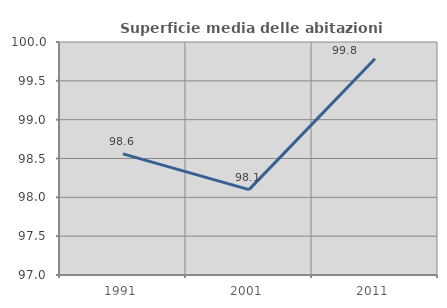
| Category | Superficie media delle abitazioni occupate |
|---|---|
| 1991.0 | 98.559 |
| 2001.0 | 98.099 |
| 2011.0 | 99.784 |